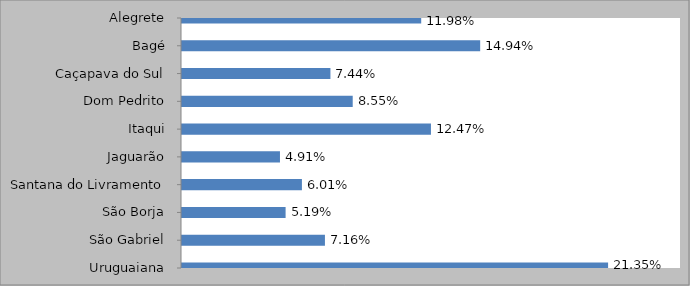
| Category | MATRIZ            (% de Alunos Equivalentes) |
|---|---|
| Alegrete | 0.12 |
| Bagé | 0.149 |
| Caçapava do Sul | 0.074 |
| Dom Pedrito | 0.086 |
| Itaqui | 0.125 |
| Jaguarão | 0.049 |
| Santana do Livramento | 0.06 |
| São Borja | 0.052 |
| São Gabriel | 0.072 |
| Uruguaiana | 0.213 |